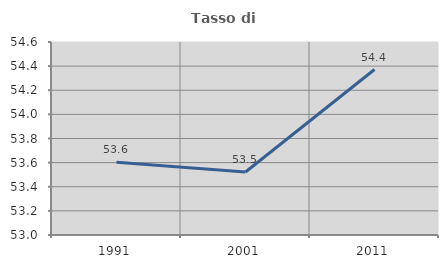
| Category | Tasso di occupazione   |
|---|---|
| 1991.0 | 53.603 |
| 2001.0 | 53.523 |
| 2011.0 | 54.372 |